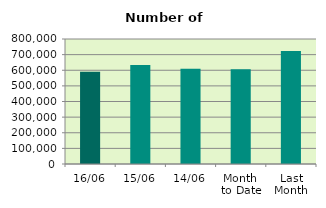
| Category | Series 0 |
|---|---|
| 16/06 | 590228 |
| 15/06 | 633088 |
| 14/06 | 610322 |
| Month 
to Date | 605638.833 |
| Last
Month | 723791.905 |